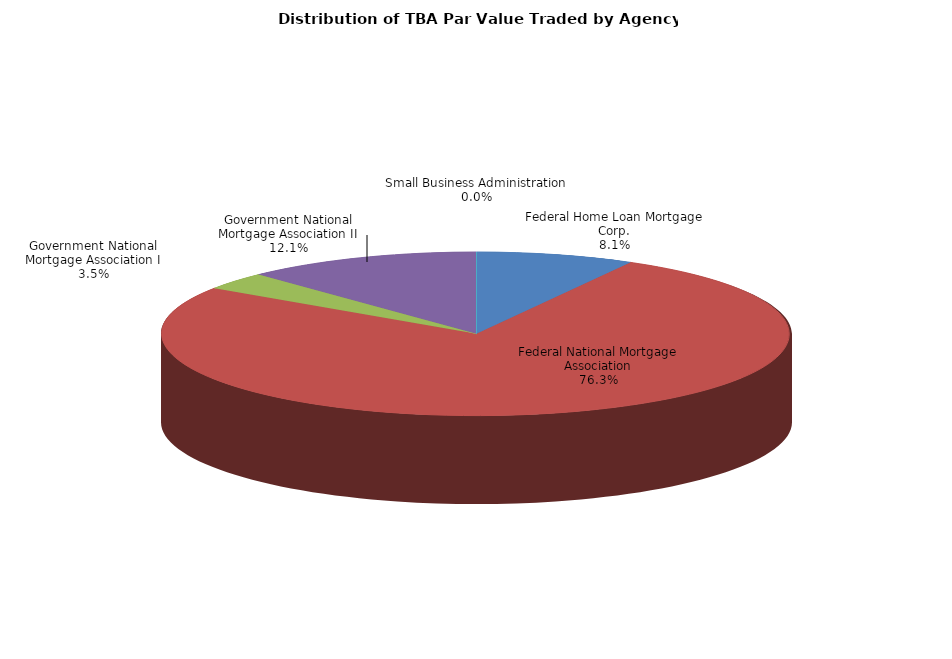
| Category | Series 0 |
|---|---|
| Federal Home Loan Mortgage Corp. | 13529542940.145 |
| Federal National Mortgage Association | 127338068093.088 |
| Government National Mortgage Association I | 5806366525.705 |
| Government National Mortgage Association II | 20222528527.329 |
| Small Business Administration | 8197219.837 |